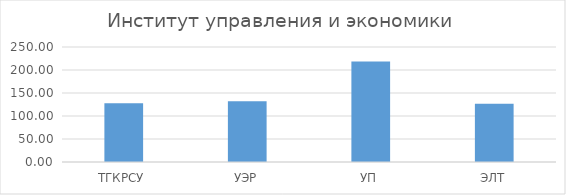
| Category | Series 0 |
|---|---|
| ТГКРСУ | 127.5 |
| УЭР | 132 |
| УП | 218.5 |
| ЭЛТ | 126.833 |